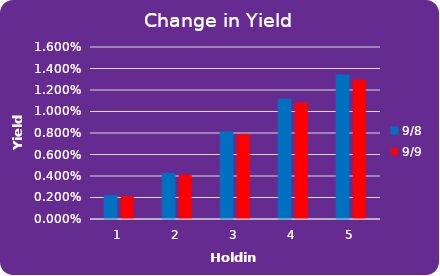
| Category | 9/8 | 9/9 |
|---|---|---|
| 0 | 0.002 | 0.002 |
| 1 | 0.004 | 0.004 |
| 2 | 0.008 | 0.008 |
| 3 | 0.011 | 0.011 |
| 4 | 0.013 | 0.013 |